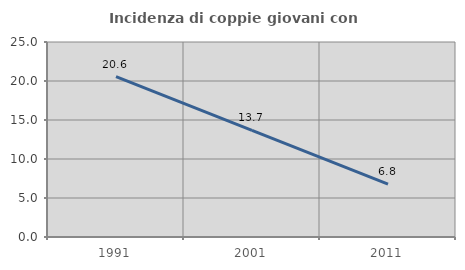
| Category | Incidenza di coppie giovani con figli |
|---|---|
| 1991.0 | 20.562 |
| 2001.0 | 13.667 |
| 2011.0 | 6.775 |